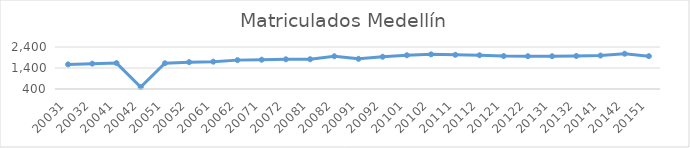
| Category | Matriculados Medellín |
|---|---|
| 20031 | 1572 |
| 20032 | 1608 |
| 20041 | 1634 |
| 20042 | 492 |
| 20051 | 1627 |
| 20052 | 1679 |
| 20061 | 1701 |
| 20062 | 1775 |
| 20071 | 1795 |
| 20072 | 1815 |
| 20081 | 1818 |
| 20082 | 1959 |
| 20091 | 1837 |
| 20092 | 1935 |
| 20101 | 2007 |
| 20102 | 2050 |
| 20111 | 2028 |
| 20112 | 2007 |
| 20121 | 1969 |
| 20122 | 1961 |
| 20131 | 1961 |
| 20132 | 1972 |
| 20141 | 1993 |
| 20142 | 2080 |
| 20151 | 1964 |